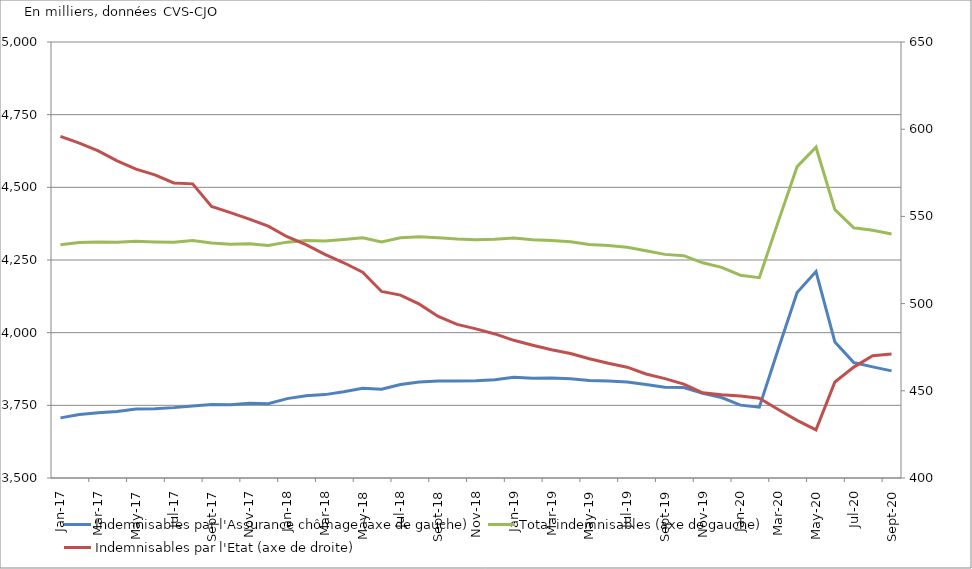
| Category | Indemnisables par l'Assurance chômage (axe de gauche) | Total indemnisables (axe de gauche) |
|---|---|---|
| 2017-01-01 | 3706.844 | 4302.714 |
| 2017-02-01 | 3718.581 | 4310.581 |
| 2017-03-01 | 3724.742 | 4312.329 |
| 2017-04-01 | 3728.904 | 4310.797 |
| 2017-05-01 | 3737.42 | 4314.565 |
| 2017-06-01 | 3738.474 | 4312.316 |
| 2017-07-01 | 3742.113 | 4311.293 |
| 2017-08-01 | 3748.041 | 4316.698 |
| 2017-09-01 | 3753.02 | 4308.754 |
| 2017-10-01 | 3752.202 | 4304.408 |
| 2017-11-01 | 3757.549 | 4305.991 |
| 2017-12-01 | 3755.545 | 4299.914 |
| 2018-01-01 | 3773.115 | 4311.476 |
| 2018-02-01 | 3783.001 | 4316.756 |
| 2018-03-01 | 3786.859 | 4315.143 |
| 2018-04-01 | 3796.762 | 4320.172 |
| 2018-05-01 | 3808.545 | 4326.578 |
| 2018-06-01 | 3805.076 | 4312.029 |
| 2018-07-01 | 3821.776 | 4326.669 |
| 2018-08-01 | 3830.399 | 4330.096 |
| 2018-09-01 | 3833.659 | 4326.273 |
| 2018-10-01 | 3834.018 | 4322.129 |
| 2018-11-01 | 3834.479 | 4319.975 |
| 2018-12-01 | 3838.374 | 4320.981 |
| 2019-01-01 | 3846.424 | 4325.367 |
| 2019-02-01 | 3843.593 | 4319.725 |
| 2019-03-01 | 3843.889 | 4317.426 |
| 2019-04-01 | 3841.119 | 4312.515 |
| 2019-05-01 | 3835.139 | 4303.552 |
| 2019-06-01 | 3833.681 | 4299.497 |
| 2019-07-01 | 3830.244 | 4293.78 |
| 2019-08-01 | 3821.842 | 4281.5 |
| 2019-09-01 | 3812.368 | 4269.334 |
| 2019-10-01 | 3811.139 | 4265.016 |
| 2019-11-01 | 3791.504 | 4240.34 |
| 2019-12-01 | 3776.752 | 4224.556 |
| 2020-01-01 | 3750.679 | 4197.728 |
| 2020-02-01 | 3743.576 | 4189.288 |
| 2020-03-01 | 3942.739 | 4382.031 |
| 2020-04-01 | 4138.092 | 4571.157 |
| 2020-05-01 | 4210.326 | 4637.956 |
| 2020-06-01 | 3968.253 | 4423.307 |
| 2020-07-01 | 3897.293 | 4360.878 |
| 2020-08-01 | 3882.301 | 4352.415 |
| 2020-09-01 | 3868.617 | 4339.722 |